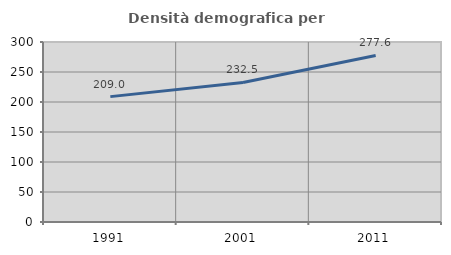
| Category | Densità demografica |
|---|---|
| 1991.0 | 208.966 |
| 2001.0 | 232.542 |
| 2011.0 | 277.604 |